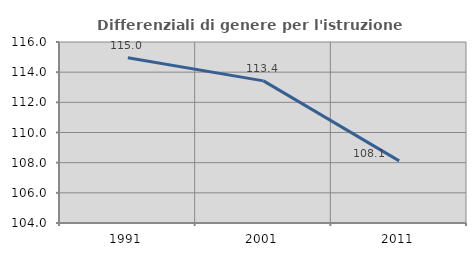
| Category | Differenziali di genere per l'istruzione superiore |
|---|---|
| 1991.0 | 114.954 |
| 2001.0 | 113.422 |
| 2011.0 | 108.12 |